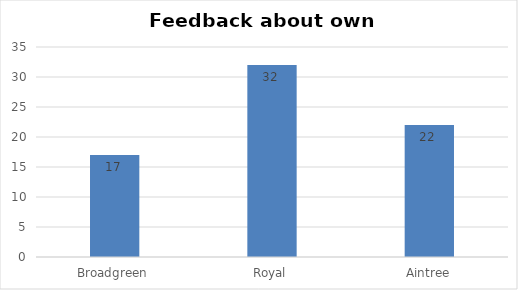
| Category | Series 0 |
|---|---|
| Broadgreen | 17 |
| Royal | 32 |
| Aintree | 22 |